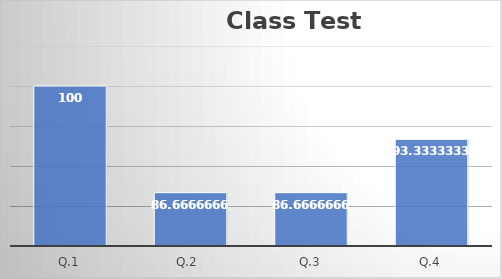
| Category | Series 0 |
|---|---|
| Q.1 | 100 |
| Q.2  | 86.667 |
| Q.3 | 86.667 |
| Q.4 | 93.333 |